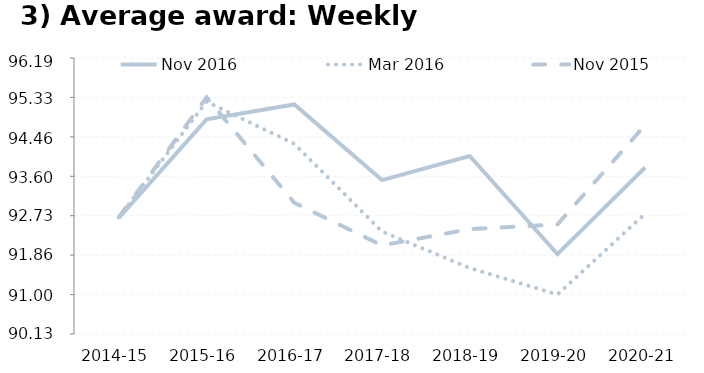
| Category | Nov 2016 | Mar 2016 | Nov 2015 |
|---|---|---|---|
| 2014-15 | 0.389 | 0.393 | 0.393 |
| 2015-16 | 0.889 | 0.978 | 1 |
| 2016-17 | 0.964 | 0.765 | 0.466 |
| 2017-18 | 0.581 | 0.32 | 0.249 |
| 2018-19 | 0.703 | 0.135 | 0.332 |
| 2019-20 | 0.205 | 0 | 0.356 |
| 2020-21 | 0.644 | 0.41 | 0.86 |